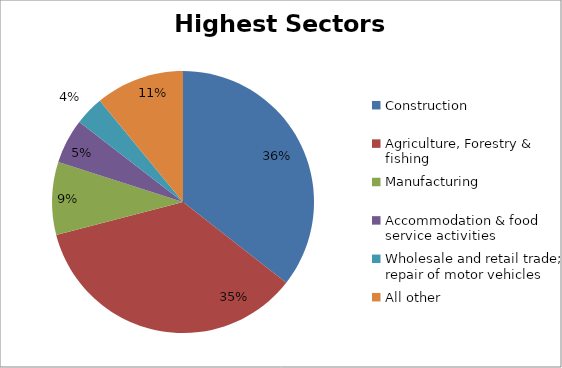
| Category | Sectors with highest totals | Percentage |
|---|---|---|
| Construction | 8310 | 0.356 |
| Agriculture, Forestry & fishing | 8273 | 0.354 |
| Manufacturing | 2104 | 0.09 |
| Accommodation & food service activities | 1290 | 0.055 |
| Wholesale and retail trade; repair of motor vehicles  | 837 | 0.036 |
| All other | 2560 | 0.11 |